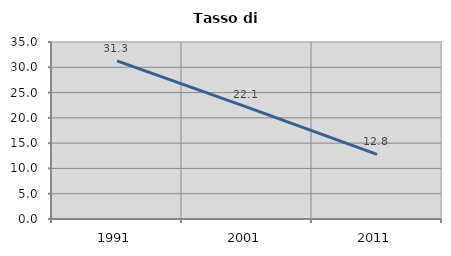
| Category | Tasso di disoccupazione   |
|---|---|
| 1991.0 | 31.265 |
| 2001.0 | 22.125 |
| 2011.0 | 12.786 |